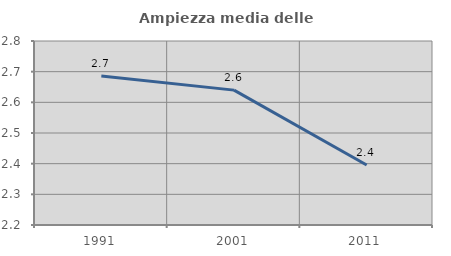
| Category | Ampiezza media delle famiglie |
|---|---|
| 1991.0 | 2.686 |
| 2001.0 | 2.64 |
| 2011.0 | 2.396 |